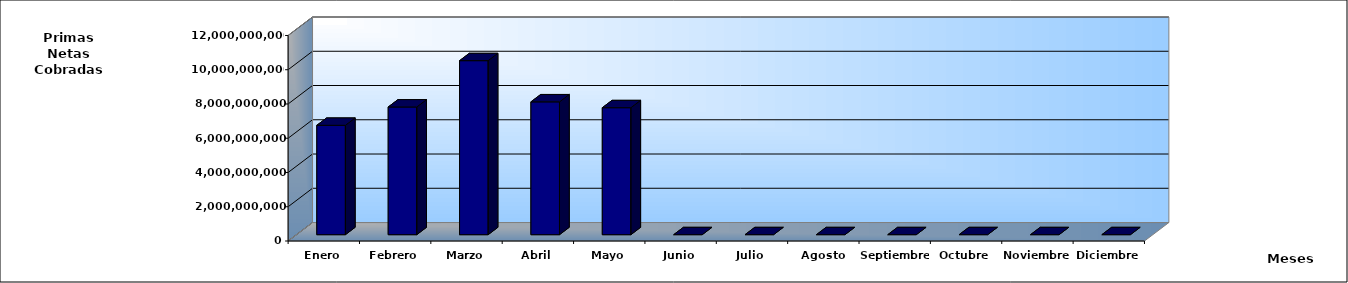
| Category | Series 0 |
|---|---|
| Enero | 6386339260.41 |
| Febrero | 7455778580.88 |
| Marzo | 10161183389.08 |
| Abril | 7756182761.13 |
| Mayo | 7413719613.01 |
| Junio | 0 |
| Julio | 0 |
| Agosto | 0 |
| Septiembre | 0 |
| Octubre | 0 |
| Noviembre | 0 |
| Diciembre | 0 |